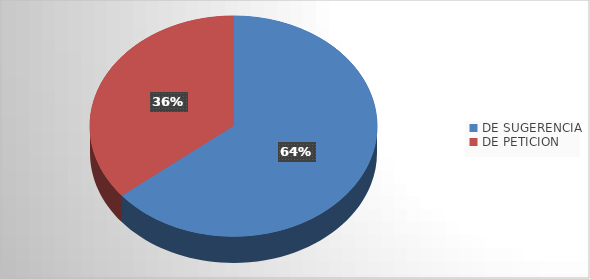
| Category | Series 0 |
|---|---|
| DE SUGERENCIA | 34 |
| DE PETICION | 19 |